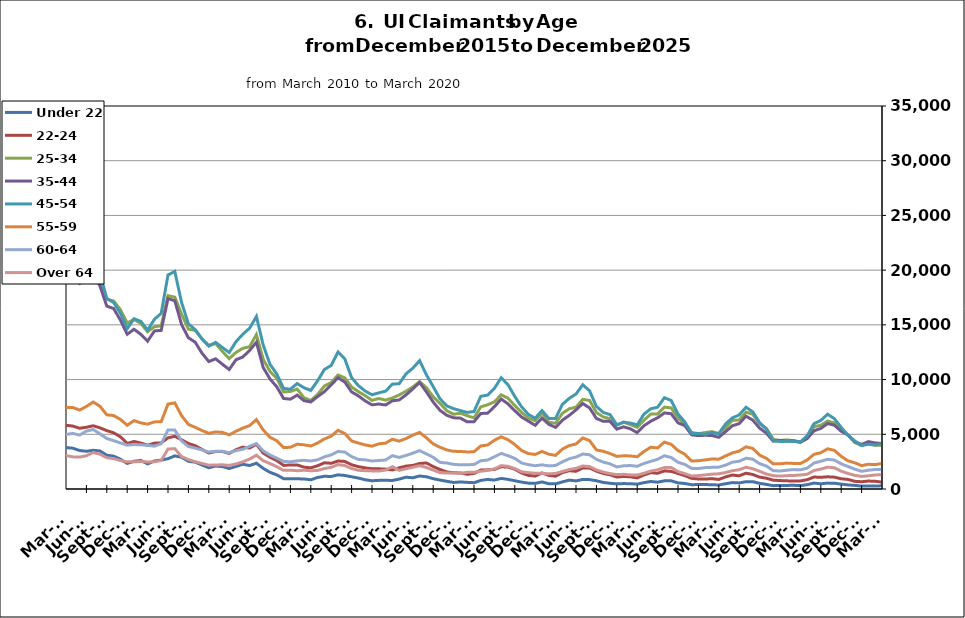
| Category | Under 22 | 22-24 | 25-34 | 35-44 | 45-54 | 55-59 | 60-64 | Over 64 |
|---|---|---|---|---|---|---|---|---|
| 1995-02-28 | 535 | 933 | 5740 | 6206 | 4029 | 1255 | 625 | 276 |
| 1995-03-31 | 534 | 992 | 5856 | 6433 | 4297 | 1294 | 686 | 323 |
| 1995-04-30 | 603 | 1125 | 6814 | 6965 | 4447 | 1392 | 730 | 338 |
| 1995-05-31 | 626 | 1171 | 7442 | 7404 | 4702 | 1383 | 751 | 333 |
| 1995-06-30 | 625 | 1218 | 7514 | 7778 | 4867 | 1435 | 813 | 366 |
| 1995-07-31 | 710 | 1296 | 8612 | 8864 | 5537 | 1595 | 891 | 407 |
| 1995-08-31 | 729 | 1248 | 8185 | 8719 | 5400 | 1604 | 982 | 406 |
| 1995-09-30 | 578 | 1028 | 6615 | 7150 | 4534 | 1351 | 862 | 338 |
| 1995-10-31 | 554 | 957 | 5805 | 6461 | 4159 | 1205 | 741 | 287 |
| 1995-11-30 | 468 | 845 | 5201 | 5826 | 3927 | 1155 | 702 | 254 |
| 1995-12-31 | 517 | 858 | 5350 | 5974 | 4010 | 1153 | 672 | 263 |
| 1996-01-31 | 543 | 927 | 5431 | 6086 | 4208 | 1221 | 685 | 301 |
| 1996-02-29 | 617 | 999 | 5667 | 6535 | 4480 | 1312 | 747 | 305 |
| 1996-03-31 | 622 | 981 | 5896 | 6557 | 4514 | 1362 | 763 | 306 |
| 1996-04-30 | 680 | 1140 | 7032 | 7649 | 5088 | 1527 | 856 | 345 |
| 1996-05-31 | 689 | 1163 | 7220 | 7819 | 5070 | 1521 | 832 | 366 |
| 1996-06-30 | 661 | 1145 | 7344 | 8173 | 5391 | 1568 | 844 | 388 |
| 1996-07-31 | 762 | 1250 | 8375 | 9181 | 6036 | 1755 | 973 | 432 |
| 1996-08-31 | 746 | 1145 | 7829 | 8585 | 5586 | 1651 | 950 | 435 |
| 1996-09-30 | 635 | 992 | 6399 | 7097 | 4790 | 1462 | 804 | 425 |
| 1996-10-31 | 572 | 851 | 5448 | 6291 | 4192 | 1259 | 693 | 340 |
| 1996-11-30 | 531 | 827 | 5003 | 5921 | 3908 | 1153 | 602 | 315 |
| 1996-12-31 | 521 | 789 | 4710 | 5510 | 3673 | 1110 | 610 | 284 |
| 1997-01-31 | 559 | 841 | 5203 | 6172 | 4321 | 1255 | 731 | 328 |
| 1997-02-28 | 556 | 841 | 5187 | 6162 | 4311 | 1250 | 727 | 326 |
| 1997-03-31 | 499 | 806 | 5125 | 6037 | 4176 | 1294 | 702 | 363 |
| 1997-04-30 | 545 | 885 | 5753 | 6709 | 4248 | 1339 | 734 | 339 |
| 1997-05-31 | 612 | 941 | 6146 | 7153 | 4458 | 1348 | 801 | 336 |
| 1997-06-30 | 623 | 995 | 6240 | 7298 | 4662 | 1302 | 776 | 348 |
| 1997-07-31 | 716 | 1154 | 7168 | 8554 | 5489 | 1509 | 903 | 415 |
| 1997-08-31 | 684 | 1072 | 6853 | 8093 | 5222 | 1487 | 837 | 416 |
| 1997-09-30 | 579 | 912 | 5522 | 6592 | 4348 | 1285 | 705 | 380 |
| 1997-10-31 | 516 | 817 | 4894.5 | 5892.5 | 3945 | 1159 | 625 | 344.5 |
| 1997-11-30 | 453 | 722 | 4267 | 5193 | 3542 | 1033 | 545 | 309 |
| 1997-12-31 | 413 | 682 | 3792 | 4755 | 3300 | 1023 | 490 | 266 |
| 1998-01-31 | 489 | 741 | 4044 | 5115 | 3513 | 1099 | 525 | 267 |
| 1998-02-28 | 435 | 684 | 3864 | 4903 | 3549 | 1043 | 571 | 285 |
| 1998-03-31 | 416 | 680 | 3855 | 5086 | 3703 | 1176 | 604 | 297 |
| 1998-04-30 | 592 | 813 | 5092 | 6219 | 4262 | 1336 | 688 | 332 |
| 1998-05-31 | 579 | 849 | 5319 | 6766 | 4554 | 1382 | 729 | 360 |
| 1998-06-30 | 568 | 899 | 5557 | 7101 | 4897 | 1405 | 783 | 367 |
| 1998-07-31 | 691 | 1031 | 6472 | 8095 | 5562 | 1589 | 880 | 392 |
| 1998-08-31 | 673 | 1007 | 6326 | 7950 | 5369 | 1574 | 935 | 393 |
| 1998-09-30 | 548 | 838 | 5206 | 6768 | 4703 | 1432 | 849 | 373 |
| 1998-10-31 | 496 | 776 | 4437 | 5582 | 3875 | 1250 | 711 | 302 |
| 1998-11-30 | 456 | 761 | 4182 | 5332 | 4015 | 1296 | 694 | 308 |
| 1998-12-31 | 442 | 722 | 4010 | 5198 | 4062 | 1331 | 656 | 290 |
| 1999-01-31 | 503 | 830 | 4502 | 5761 | 4521 | 1490 | 751 | 297 |
| 1999-02-28 | 463 | 756 | 4267 | 5576 | 4431 | 1470 | 767 | 301 |
| 1999-03-31 | 435 | 688 | 4119 | 5519 | 4403 | 1516 | 765 | 331 |
| 1999-04-30 | 591 | 949 | 5292 | 7089 | 5468 | 1724 | 914 | 489 |
| 1999-05-31 | 674 | 911 | 5611 | 7459 | 5457 | 1710 | 934 | 500 |
| 1999-06-30 | 640 | 906 | 5660 | 7503 | 5333 | 1695 | 920 | 495 |
| 1999-07-31 | 766 | 1132 | 6820 | 9256 | 6620 | 1981 | 1001 | 549 |
| 1999-08-31 | 738 | 1117 | 6737 | 9030 | 6670 | 2019 | 1075 | 582 |
| 1999-09-30 | 600 | 968 | 5167 | 7169 | 5458 | 1712 | 892 | 465 |
| 1999-10-31 | 494 | 813 | 4501 | 6048 | 4682 | 1443 | 743 | 363 |
| 1999-11-30 | 464 | 768 | 4228 | 5593 | 4564 | 1392 | 702 | 313 |
| 1999-12-31 | 468.5 | 754.5 | 4149 | 5486.5 | 4505 | 1429 | 673 | 304 |
| 2000-01-31 | 473 | 741 | 4070 | 5380 | 4446 | 1466 | 644 | 295 |
| 2000-02-29 | 460 | 691 | 3807 | 5357 | 4470 | 1469 | 707 | 310 |
| 2000-03-31 | 412 | 652 | 3864 | 5499 | 4568 | 1508 | 816 | 389 |
| 2000-04-30 | 585 | 829 | 4741 | 6891 | 5127 | 1631 | 906 | 451 |
| 2000-05-31 | 627 | 875 | 5086 | 7211 | 5238 | 1598 | 956 | 489 |
| 2000-06-30 | 675 | 983 | 5624 | 7826 | 5562 | 1669 | 941 | 524 |
| 2000-07-31 | 802 | 1109 | 6475 | 9102 | 6450 | 1927 | 1097 | 594 |
| 2000-08-31 | 787 | 1058 | 6045 | 8732 | 6157 | 1894 | 1085 | 616 |
| 2000-09-30 | 607 | 897 | 4766 | 6864 | 5037 | 1486 | 902 | 479 |
| 2000-10-31 | 544 | 760 | 4267 | 5897 | 4465 | 1323 | 762 | 394 |
| 2000-11-30 | 535 | 797 | 3982 | 5439 | 4318 | 1256 | 702 | 396 |
| 2000-12-31 | 508 | 832 | 3891 | 5255 | 4218 | 1246 | 694 | 361 |
| 2001-01-31 | 627 | 892 | 4229 | 5724 | 4777 | 1300 | 721 | 393 |
| 2001-02-28 | 643 | 934 | 4553 | 6302 | 5224 | 1529 | 849 | 472 |
| 2001-03-31 | 412 | 648 | 3625 | 5081 | 4551 | 1413 | 778 | 440 |
| 2001-04-30 | 875 | 1276 | 6577 | 8914 | 7196 | 2144 | 1185 | 639 |
| 2001-05-31 | 944 | 1399 | 7133 | 9570 | 7651 | 2265 | 1231 | 679 |
| 2001-06-30 | 1041 | 1584 | 8072 | 11034 | 8621 | 2613 | 1398 | 756 |
| 2001-07-31 | 1135 | 1806 | 9038 | 12514 | 9691 | 2970 | 1611 | 848 |
| 2001-08-31 | 1116 | 1776 | 8753 | 12045 | 9560 | 2963 | 1691 | 898 |
| 2001-09-30 | 1046 | 1705 | 8118 | 11025 | 8788 | 2784 | 1608 | 833 |
| 2001-10-31 | 1094 | 1785 | 8459 | 11114 | 8850 | 2772 | 1610 | 777 |
| 2001-11-30 | 1154 | 1931 | 9131 | 11576 | 9447 | 2973 | 1661 | 778 |
| 2001-12-31 | 1280 | 2191 | 9917 | 11961 | 9905 | 3152 | 1740 | 780 |
| 2002-01-31 | 1330 | 2255 | 10364 | 12730 | 10592 | 3378 | 1843 | 821 |
| 2002-02-28 | 1347 | 2339 | 10349 | 12730 | 10784 | 3499 | 1861 | 867 |
| 2002-03-31 | 1266 | 2231 | 9963 | 12747 | 10614 | 3499 | 1867 | 979 |
| 2002-04-30 | 1412 | 2488 | 11603 | 15825 | 13571 | 4631 | 2389 | 1146 |
| 2002-05-31 | 1455 | 2421 | 11243 | 15509 | 13148 | 4374 | 2359 | 1195 |
| 2002-06-30 | 1534 | 2479 | 11416 | 15594 | 13261 | 4343 | 2365 | 1180 |
| 2002-07-31 | 1513 | 2614 | 11895 | 16242 | 13727 | 4439 | 2428 | 1255 |
| 2002-08-31 | 1022 | 1977 | 8719 | 12054 | 10588 | 3454 | 1990 | 1047 |
| 2002-09-30 | 1391 | 2528 | 10478 | 14010 | 12008 | 3847 | 2161 | 1166 |
| 2002-10-31 | 1401 | 2385 | 9826 | 12727 | 10778 | 3498 | 1886 | 973 |
| 2002-11-30 | 1344 | 2390 | 9846 | 12059 | 10297 | 3367 | 1833 | 958 |
| 2002-12-31 | 1311 | 2403 | 9841 | 11670 | 10177 | 3369 | 1871 | 894 |
| 2003-01-31 | 1311 | 2403 | 9841 | 11670 | 10177 | 3369 | 1871 | 894 |
| 2003-02-28 | 1367 | 2275 | 9730 | 12433 | 10806 | 3687 | 2016 | 974 |
| 2003-03-31 | 1367 | 2357 | 9844 | 12620 | 11167 | 3825 | 2151 | 1094 |
| 2003-04-30 | 1549 | 2525 | 10619 | 14142 | 12182 | 4004 | 2304 | 1190 |
| 2003-05-31 | 1663 | 2698 | 10843 | 14795 | 12539 | 4102 | 2395 | 1256 |
| 2003-06-30 | 1755 | 2770 | 11350 | 15575 | 13251 | 4301 | 2493 | 1325 |
| 2003-07-31 | 1748 | 2791 | 11577 | 15863 | 13772 | 4465 | 2593 | 1371 |
| 2003-08-31 | 1718 | 2653 | 10998 | 15261 | 13219 | 4325 | 2522 | 1359 |
| 2003-09-30 | 1494 | 2521 | 10071 | 13565 | 11659 | 3828 | 2278 | 1286 |
| 2003-10-31 | 1329 | 2432 | 9388 | 12107 | 10693 | 3567 | 2036 | 1129 |
| 2003-11-30 | 1191 | 2226 | 8954 | 11297 | 10037 | 3414 | 2004 | 1068 |
| 2003-12-31 | 1206 | 2184 | 8530 | 10413 | 9335 | 3215 | 1854 | 994 |
| 2004-01-31 | 1216 | 2171 | 8382 | 9858 | 8955 | 2992 | 1736 | 963 |
| 2004-02-29 | 1118 | 1879 | 7614 | 8935 | 8176 | 2761 | 1617 | 943 |
| 2004-03-31 | 1099 | 1749 | 7152 | 8565 | 7769 | 2686 | 1608 | 981 |
| 2004-04-30 | 1241 | 1951 | 7653 | 9981 | 8741 | 2872 | 1685 | 1056 |
| 2004-05-31 | 1245 | 1934 | 7651 | 10203 | 8820 | 2928 | 1703 | 1079 |
| 2004-06-30 | 1316 | 2086 | 8172 | 10636 | 9362 | 3146 | 1843 | 1081 |
| 2004-07-31 | 1476 | 2265 | 8795 | 11511 | 10439 | 3497 | 2008 | 1171 |
| 2004-08-31 | 1390 | 2055 | 8008 | 10418 | 9514 | 3304 | 1909 | 1105 |
| 2004-09-30 | 1129 | 1820 | 6987 | 8661 | 7694 | 2755 | 1623 | 1046 |
| 2004-10-31 | 1037 | 1675 | 6590 | 7964 | 7029 | 2459 | 1461 | 882 |
| 2004-11-30 | 954 | 1638 | 6342 | 7570 | 6733 | 2294 | 1383 | 841 |
| 2004-12-31 | 857 | 1533 | 5921 | 6991 | 6333 | 2225 | 1287 | 764 |
| 2005-01-31 | 893 | 1539 | 6047 | 7410 | 6682 | 2253 | 1274 | 788 |
| 2005-02-28 | 846 | 1361 | 5650 | 6952 | 6404 | 2198 | 1326 | 786 |
| 2005-03-31 | 747 | 1258 | 5313 | 6595 | 6251 | 2151 | 1327 | 742 |
| 2005-04-30 | 877 | 1375 | 5696 | 7717 | 7230 | 2440 | 1401 | 844 |
| 2005-05-31 | 854 | 1408 | 5674 | 7905 | 7454 | 2482 | 1453 | 858 |
| 2005-06-30 | 819 | 1444 | 6028 | 8565 | 7899 | 2613 | 1547 | 890 |
| 2005-07-31 | 900 | 1461 | 6395 | 9124 | 8614 | 2864 | 1640 | 1004 |
| 2005-08-31 | 805 | 1439 | 5917 | 8271 | 8076 | 2692 | 1587 | 945 |
| 2005-09-30 | 631 | 1209 | 4978 | 6413 | 6203 | 2116 | 1312 | 724 |
| 2005-10-31 | 638 | 1134 | 4602 | 6028 | 5688 | 1997 | 1171 | 656 |
| 2005-11-30 | 564 | 1071 | 4409 | 5563 | 5105 | 1791 | 1035 | 580 |
| 2005-12-31 | 523 | 987 | 4014 | 4983 | 4531 | 1673 | 968 | 546 |
| 2006-01-31 | 531 | 925 | 3900 | 5012 | 4793 | 1691 | 1008 | 539 |
| 2006-02-28 | 447 | 804 | 3534 | 4388 | 4403 | 1586 | 980 | 549 |
| 2006-03-31 | 399 | 785 | 3455 | 4472 | 4584 | 1680 | 1069 | 618 |
| 2006-04-30 | 527 | 945 | 4004 | 5859 | 5921 | 1965 | 1251 | 744 |
| 2006-05-31 | 594 | 964 | 4205 | 6365 | 6369 | 2156 | 1327 | 792 |
| 2006-06-30 | 660 | 1113 | 4742 | 7052 | 7094 | 2386 | 1474 | 933 |
| 2006-07-31 | 771 | 1183 | 5214 | 7974 | 8007 | 2685 | 1635 | 1072 |
| 2006-08-31 | 737 | 1202 | 5116 | 7524 | 7553 | 2671 | 1590 | 1019 |
| 2006-09-30 | 596 | 1086 | 4608 | 6175 | 6389 | 2256 | 1287 | 812 |
| 2006-10-31 | 596 | 1056 | 4585 | 5758 | 5788 | 2026 | 1164 | 696 |
| 2006-11-30 | 542 | 1003 | 4370 | 5304 | 5388 | 1812 | 1082 | 604 |
| 2006-12-31 | 553 | 1102 | 4425 | 5291 | 5310 | 1801 | 1099 | 603 |
| 2007-01-31 | 587 | 1147 | 4542 | 5619 | 5506 | 1920 | 1174 | 663 |
| 2007-02-28 | 544 | 1090 | 4490 | 5562 | 5616 | 1982 | 1260 | 705 |
| 2007-03-31 | 558 | 1089 | 4498 | 5595 | 5708 | 2016 | 1378 | 717 |
| 2007-04-30 | 760 | 1203 | 5015 | 6827 | 6871 | 2316 | 1536 | 856 |
| 2007-05-31 | 806 | 1285 | 5542 | 7679 | 7763 | 2571 | 1719 | 1021 |
| 2007-06-30 | 862 | 1340 | 6100 | 8324 | 8341 | 2812 | 1896 | 1060 |
| 2007-07-31 | 980 | 1524 | 6616 | 9184 | 9522 | 3226 | 2038 | 1250 |
| 2007-08-31 | 950 | 1510 | 6266 | 8359 | 8842 | 3033 | 1949 | 1157 |
| 2007-09-30 | 865 | 1595 | 6213 | 7798 | 7957 | 2790 | 1816 | 1090 |
| 2007-10-31 | 883 | 1517 | 6214 | 7229 | 7503 | 2574 | 1630 | 978 |
| 2007-11-15 | 816 | 1424 | 5981 | 6740 | 6999 | 2468 | 1510 | 860 |
| 2007-12-15 09:36:00 | 851 | 1536 | 6411 | 6986 | 7174 | 2572 | 1584 | 874 |
| 2008-01-14 19:12:00 | 963 | 1628 | 6836 | 7533 | 7742 | 2786 | 1744 | 940 |
| 2008-02-14 04:48:00 | 982 | 1565 | 6847 | 7767 | 8031 | 2958 | 1823 | 985 |
| 2008-03-15 14:24:00 | 1029 | 1666 | 7210 | 8036 | 8353 | 3105 | 1898 | 1085 |
| 2008-04-15 | 1182 | 1889 | 7894 | 9339 | 9822 | 3537 | 2184 | 1246 |
| 2008-05-15 09:36:00 | 1325 | 2099 | 8651 | 10315 | 11003 | 3871 | 2423 | 1448 |
| 2008-06-14 19:12:00 | 1405 | 2238 | 9567 | 11330 | 12040 | 4322 | 2650 | 1572 |
| 2008-07-15 04:48:00 | 1616 | 2488 | 10336 | 12349 | 13396 | 4698 | 3083 | 1801 |
| 2008-08-14 14:24:00 | 1753 | 2665 | 10716 | 12486 | 13444 | 4795 | 3139 | 1802 |
| 2008-09-14 | 1800 | 2924 | 11552 | 12686 | 13602 | 4801 | 3180 | 1811 |
| 2008-10-14 09:36:00 | 1936 | 3131 | 12284 | 13322 | 13831 | 4989 | 3183 | 1808 |
| 2008-11-13 19:12:00 | 2093 | 3414 | 13577 | 14724 | 15130 | 5413 | 3440 | 1946 |
| 2008-12-14 04:48:00 | 2495 | 4020 | 15380 | 16325 | 16846 | 6098 | 3755 | 2155 |
| 2009-01-13 14:24:00 | 3054 | 4678 | 17678 | 18452 | 19095 | 6788 | 4182 | 2364 |
| 2009-02-13 | 3531 | 5304 | 19793 | 20788 | 21601 | 7727 | 4836 | 2718 |
| 2009-03-15 09:36:00 | 3891 | 5925 | 22303 | 23139 | 24352 | 8876 | 5515 | 3141 |
| 2009-04-14 19:12:00 | 4291 | 6403 | 23925 | 25362 | 26817 | 9618 | 6020 | 3494 |
| 2009-05-15 04:48:00 | 4410 | 6521 | 24301 | 25794 | 27238 | 9735 | 6181 | 3529 |
| 2009-06-14 14:24:00 | 4405 | 6853 | 25234 | 26806 | 28296 | 10256 | 6673 | 3804 |
| 2009-07-15 | 4729 | 7280 | 26132 | 27836 | 29724 | 10830 | 6950 | 4125 |
| 2009-08-14 09:36:00 | 4717 | 7069 | 25281 | 26184 | 27877 | 10164 | 6719 | 3918 |
| 2009-09-13 19:12:00 | 4741 | 7291 | 25029 | 24981 | 26018 | 9679 | 6210 | 3594 |
| 2009-10-14 04:48:00 | 4656 | 7051 | 24241 | 23779 | 24730 | 9034 | 5817 | 3422 |
| 2009-11-13 14:24:00 | 4421 | 6817 | 23760 | 22851 | 23515 | 8627 | 5549 | 3297 |
| 2009-12-14 | 4232 | 6586 | 23118 | 22038 | 22501 | 8496 | 5370 | 3295 |
| 2010-01-13 09:36:00 | 4276 | 6583 | 22706 | 21421 | 22132 | 8135 | 5154 | 3134 |
| 2010-02-12 19:12:00 | 4133 | 6142 | 21386 | 20012 | 21036 | 7728 | 5039 | 3047 |
| 2010-03-15 04:48:00 | 3784 | 5822 | 20418 | 19073 | 20556 | 7446 | 4983 | 3062 |
| 2010-04-14 14:24:00 | 3731 | 5751 | 20058 | 19261 | 21012 | 7449 | 5078 | 2936 |
| 2010-05-15 | 3516 | 5553 | 19393 | 18793 | 20409 | 7213 | 4923 | 2915 |
| 2010-06-14 09:36:00 | 3450 | 5640 | 19615 | 19385 | 20781 | 7547 | 5293 | 3043 |
| 2010-07-14 19:12:00 | 3536 | 5781 | 19820 | 19714 | 21269 | 7946 | 5439 | 3330 |
| 2010-08-14 04:48:00 | 3477 | 5590 | 18902 | 18548 | 19686 | 7561 | 5039 | 3181 |
| 2010-09-13 14:24:00 | 3083 | 5332 | 17344 | 16712 | 17408 | 6775 | 4612 | 2859 |
| 2010-10-14 | 3004 | 5138 | 17187 | 16492 | 17042 | 6713 | 4418 | 2779 |
| 2010-11-13 09:36:00 | 2724 | 4771 | 16387 | 15438 | 16061 | 6360 | 4209 | 2601 |
| 2010-12-13 19:12:00 | 2335 | 4159 | 15175 | 14143 | 14646 | 5823 | 4003 | 2480 |
| 2011-01-13 04:48:00 | 2530 | 4343 | 15492 | 14596 | 15561 | 6250 | 4059 | 2487 |
| 2011-02-12 14:24:00 | 2609 | 4202 | 15131 | 14142 | 15320 | 6044 | 4041 | 2517 |
| 2011-03-15 | 2290 | 3998 | 14370 | 13505 | 14523 | 5925 | 3990 | 2470 |
| 2011-04-14 09:36:00 | 2563 | 4190 | 14834 | 14445 | 15508 | 6130 | 3916 | 2488 |
| 2011-05-14 19:12:00 | 2642 | 4217 | 14917 | 14494 | 16051 | 6156 | 4129 | 2602 |
| 2011-06-14 04:48:00 | 2767 | 4676 | 17673 | 17404 | 19563 | 7763 | 5398 | 3653 |
| 2011-07-14 14:24:00 | 3027 | 4815 | 17530 | 17197 | 19880 | 7870 | 5384 | 3686 |
| 2011-08-14 | 2900 | 4498 | 15970 | 15020 | 17035 | 6697 | 4394 | 2956 |
| 2011-09-13 09:36:00 | 2531 | 4156 | 14609 | 13818 | 15092 | 5903 | 3881 | 2687 |
| 2011-10-13 19:12:00 | 2452 | 3959 | 14501 | 13415 | 14565 | 5635 | 3734 | 2491 |
| 2011-11-13 04:48:00 | 2197 | 3615 | 13732 | 12410 | 13698 | 5345 | 3574 | 2339 |
| 2011-12-13 14:24:00 | 1938 | 3290 | 13130 | 11646 | 13054 | 5089 | 3380 | 2177 |
| 2012-01-13 | 2098 | 3424 | 13293 | 11897 | 13400 | 5218 | 3448 | 2197 |
| 2012-02-12 09:36:00 | 2047 | 3428 | 12569 | 11400 | 12931 | 5177 | 3445 | 2212 |
| 2012-03-13 19:12:00 | 1870 | 3252 | 11913 | 10922 | 12476 | 4948 | 3317 | 2155 |
| 2012-04-13 04:48:00 | 2063 | 3590 | 12479 | 11814 | 13464 | 5278 | 3509 | 2287 |
| 2012-05-13 14:24:00 | 2260 | 3828 | 12852 | 12063 | 14139 | 5562 | 3628 | 2485 |
| 2012-06-13 | 2147 | 3747 | 13008 | 12659 | 14694 | 5791 | 3902 | 2736 |
| 2012-07-13 09:36:00 | 2358 | 4087 | 14109 | 13412 | 15770 | 6346 | 4156 | 3086 |
| 2012-08-12 19:12:00 | 1887 | 3284 | 11852 | 11102 | 13153 | 5396 | 3487 | 2583 |
| 2012-09-12 04:48:00 | 1524 | 2903 | 10742 | 10051 | 11393 | 4726 | 3103 | 2327 |
| 2012-10-12 14:24:00 | 1289 | 2603 | 10123 | 9339 | 10510 | 4405 | 2813 | 2032 |
| 2012-11-12 | 945 | 2155 | 8870 | 8273 | 9193 | 3781 | 2520 | 1702 |
| 2012-12-12 09:36:00 | 937 | 2201 | 8913 | 8210 | 9124 | 3816 | 2491 | 1722 |
| 2013-01-11 19:12:00 | 934 | 2199 | 9132 | 8579 | 9635 | 4095 | 2569 | 1667 |
| 2013-02-11 04:48:00 | 915 | 1996 | 8343 | 8072 | 9253 | 4034 | 2623 | 1715 |
| 2013-03-13 14:24:00 | 845 | 1934 | 8092 | 7955 | 9007 | 3929 | 2561 | 1667 |
| 2013-04-13 | 1055 | 2124 | 8637 | 8445 | 9891 | 4204 | 2666 | 1698 |
| 2013-05-13 09:36:00 | 1160 | 2394 | 9413 | 8898 | 10920 | 4574 | 2940 | 1871 |
| 2013-06-12 19:12:00 | 1145 | 2351 | 9732 | 9510 | 11293 | 4830 | 3115 | 1976 |
| 2013-07-13 04:48:00 | 1294 | 2558 | 10421 | 10174 | 12520 | 5363 | 3434 | 2233 |
| 2013-08-12 14:24:00 | 1238 | 2519 | 10150 | 9771 | 11886 | 5067 | 3372 | 2140 |
| 2013-09-12 | 1116 | 2214 | 9323 | 8874 | 10178 | 4389 | 2964 | 1871 |
| 2013-10-12 09:36:00 | 1000 | 2044 | 8893 | 8509 | 9449 | 4200 | 2701 | 1709 |
| 2013-11-11 19:12:00 | 842 | 1927 | 8532 | 8049 | 8950 | 4028 | 2665 | 1675 |
| 2013-12-12 04:48:00 | 753 | 1854 | 8098 | 7692 | 8612 | 3913 | 2557 | 1655 |
| 2014-01-11 14:24:00 | 788 | 1846 | 8270 | 7762 | 8786 | 4128 | 2606 | 1642 |
| 2014-02-11 | 795 | 1817 | 8124 | 7677 | 8944 | 4189 | 2646 | 1728 |
| 2014-03-13 09:36:00 | 782 | 1741 | 8319 | 8063 | 9583 | 4550 | 3048 | 2040 |
| 2014-04-12 19:12:00 | 905 | 1940 | 8594 | 8138 | 9620 | 4372 | 2886 | 1706 |
| 2014-05-13 04:48:00 | 1079 | 2093 | 8933 | 8593 | 10522 | 4609 | 3062 | 1850 |
| 2014-06-12 14:24:00 | 1028 | 2152 | 9323 | 9148 | 11040 | 4920 | 3274 | 1985 |
| 2014-07-13 | 1189 | 2333 | 9808 | 9735 | 11729 | 5171 | 3509 | 2133 |
| 2014-08-14 | 1119 | 2379 | 9259 | 8876 | 10438 | 4678 | 3210 | 1962 |
| 2014-09-13 09:36:00 | 943 | 2048 | 8430 | 7946 | 9358 | 4119 | 2891 | 1734 |
| 2014-10-13 19:12:00 | 816 | 1781 | 7821 | 7185 | 8244 | 3813 | 2437 | 1486 |
| 2014-11-13 04:48:00 | 703 | 1557 | 7150 | 6736 | 7594 | 3571 | 2374 | 1466 |
| 2014-12-13 14:24:00 | 597 | 1482 | 6833 | 6507 | 7340 | 3442 | 2255 | 1458 |
| 2015-01-13 | 646 | 1466 | 6927 | 6477 | 7168 | 3432 | 2210 | 1429 |
| 2015-02-12 09:36:00 | 607 | 1346 | 6696 | 6134 | 6999 | 3383 | 2220 | 1525 |
| 2015-03-14 19:12:00 | 577 | 1416 | 6499 | 6145 | 7077 | 3405 | 2233 | 1530 |
| 2015-04-14 04:48:00 | 784 | 1736 | 7505 | 6901 | 8468 | 3935 | 2586 | 1624 |
| 2015-05-14 14:24:00 | 875 | 1749 | 7696 | 6925 | 8578 | 4020 | 2644 | 1698 |
| 2015-06-14 | 818 | 1789 | 7961 | 7519 | 9200 | 4452 | 2943 | 1839 |
| 2015-07-14 09:36:00 | 966 | 2033 | 8609 | 8223 | 10167 | 4766 | 3254 | 2136 |
| 2015-08-13 19:12:00 | 880 | 2007 | 8302 | 7779 | 9530 | 4503 | 3045 | 2073 |
| 2015-09-13 04:48:00 | 752 | 1807 | 7615 | 7153 | 8455 | 4067 | 2798 | 1870 |
| 2015-10-13 14:24:00 | 630 | 1461 | 6995 | 6578 | 7509 | 3519 | 2375 | 1570 |
| 2015-11-13 | 533 | 1246 | 6491 | 6196 | 6815 | 3237 | 2224 | 1493 |
| 2015-12-13 09:36:00 | 512 | 1179 | 6242 | 5823 | 6474 | 3158 | 2123 | 1439 |
| 2016-01-12 19:12:00 | 646 | 1466 | 6927 | 6477 | 7168 | 3432 | 2210 | 1429 |
| 2016-02-12 04:48:00 | 482 | 1246 | 6101 | 5912 | 6452 | 3180 | 2110 | 1385 |
| 2016-03-13 14:24:00 | 474 | 1170 | 6011 | 5629 | 6452 | 3073 | 2152 | 1420 |
| 2016-04-13 | 648 | 1494 | 6917 | 6287 | 7737 | 3648 | 2483 | 1600 |
| 2016-05-13 09:36:00 | 812 | 1670 | 7326 | 6725 | 8279 | 3967 | 2765 | 1776 |
| 2016-06-12 19:12:00 | 738 | 1622 | 7479 | 7230 | 8681 | 4111 | 2920 | 1886 |
| 2016-07-13 04:48:00 | 875 | 1919 | 8193 | 7814 | 9525 | 4662 | 3196 | 2105 |
| 2016-08-12 14:24:00 | 858 | 1920 | 8091 | 7407 | 8969 | 4420 | 3130 | 2050 |
| 2016-09-12 | 752 | 1632 | 6992 | 6450 | 7548 | 3573 | 2713 | 1747 |
| 2016-10-12 09:36:00 | 602 | 1423 | 6590 | 6190 | 6998 | 3448 | 2457 | 1544 |
| 2016-11-11 19:12:00 | 523 | 1296 | 6418 | 6179 | 6801 | 3241 | 2299 | 1410 |
| 2016-12-12 04:48:00 | 468 | 1096 | 5827 | 5472 | 5867 | 2981 | 2019 | 1311 |
| 2017-01-11 14:24:00 | 495 | 1150 | 6111 | 5679 | 6108 | 3035 | 2115 | 1342 |
| 2017-02-11 | 484 | 1109 | 5882 | 5500 | 6023 | 3023 | 2148 | 1289 |
| 2017-03-13 09:36:00 | 442 | 1015 | 5634 | 5148 | 5865 | 2942 | 2075 | 1278 |
| 2017-04-12 19:12:00 | 585 | 1285 | 6292 | 5783 | 6842 | 3434 | 2336 | 1435 |
| 2017-05-13 04:48:00 | 686 | 1492 | 6844 | 6200 | 7332 | 3817 | 2526 | 1637 |
| 2017-06-12 14:24:00 | 623 | 1435 | 6852 | 6505 | 7473 | 3751 | 2713 | 1754 |
| 2017-07-13 | 745 | 1658 | 7483 | 6953 | 8339 | 4284 | 3038 | 1964 |
| 2017-08-12 09:36:00 | 745 | 1605 | 7411 | 6880 | 8092 | 4080 | 2878 | 1966 |
| 2017-09-11 19:12:00 | 559 | 1420 | 6481 | 6045 | 6845 | 3511 | 2443 | 1591 |
| 2017-10-12 04:48:00 | 503 | 1224 | 5960 | 5790 | 6135 | 3181 | 2245 | 1400 |
| 2017-11-11 14:24:00 | 390 | 972 | 5167 | 4951 | 5077 | 2553 | 1887 | 1188 |
| 2017-12-12 | 413 | 914 | 5058 | 4876 | 5071 | 2585 | 1870 | 1226 |
| 2018-01-11 09:36:00 | 411 | 912 | 5154 | 4909 | 5000 | 2656 | 1952 | 1288 |
| 2018-02-10 19:12:00 | 383 | 940 | 5246 | 4884 | 5165 | 2743 | 1980 | 1355 |
| 2018-03-13 04:48:00 | 373 | 875 | 5018 | 4724 | 5075 | 2723 | 1999 | 1389 |
| 2018-04-12 14:24:00 | 478 | 1104 | 5584 | 5240 | 5944 | 3026 | 2179 | 1506 |
| 2018-05-13 | 586 | 1275 | 6280 | 5780 | 6500 | 3300 | 2452 | 1670 |
| 2018-06-12 09:36:00 | 554 | 1207 | 6302 | 5974 | 6766 | 3462 | 2534 | 1762 |
| 2018-07-12 19:12:00 | 666 | 1445 | 7024 | 6656 | 7473 | 3858 | 2810 | 1989 |
| 2018-08-12 04:48:00 | 671 | 1323 | 6823 | 6293 | 7046 | 3706 | 2722 | 1850 |
| 2018-09-11 14:24:00 | 518 | 1084 | 5965 | 5563 | 6066 | 3091 | 2318 | 1618 |
| 2018-10-12 | 419 | 985 | 5538 | 5106 | 5464 | 2806 | 2102 | 1367 |
| 2018-11-11 09:36:00 | 306 | 808 | 4542 | 4371 | 4433 | 2297 | 1673 | 1222 |
| 2018-12-11 19:12:00 | 328 | 771 | 4439 | 4429 | 4340 | 2303 | 1646 | 1174 |
| 2019-01-11 04:48:00 | 327 | 743 | 4491 | 4378 | 4359 | 2368 | 1715 | 1218 |
| 2019-02-10 14:24:00 | 338 | 739 | 4402 | 4415 | 4345 | 2337 | 1773 | 1237 |
| 2019-03-13 | 306 | 738 | 4246 | 4293 | 4304 | 2328 | 1756 | 1281 |
| 2019-04-12 09:36:00 | 396 | 850 | 4657 | 4603 | 4871 | 2655 | 1900 | 1347 |
| 2019-05-12 19:12:00 | 541 | 1092 | 5700 | 5319 | 5974 | 3169 | 2371 | 1690 |
| 2019-06-12 04:48:00 | 476 | 1070 | 5822 | 5537 | 6262 | 3317 | 2534 | 1820 |
| 2019-07-12 14:24:00 | 538 | 1114 | 6206 | 5980 | 6836 | 3673 | 2717 | 1996 |
| 2019-08-12 | 528 | 1084 | 6044 | 5828 | 6422 | 3535 | 2645 | 1942 |
| 2019-09-11 09:36:00 | 445 | 932 | 5379 | 5275 | 5630 | 2979 | 2299 | 1624 |
| 2019-10-11 19:12:00 | 372 | 877 | 4949 | 4938 | 4922 | 2579 | 2058 | 1418 |
| 2019-11-11 04:48:00 | 332 | 701 | 4242 | 4332 | 4379 | 2392 | 1809 | 1247 |
| 2019-12-11 14:24:00 | 261 | 663 | 3977 | 4071 | 3974 | 2137 | 1619 | 1150 |
| 2020-01-11 | 272 | 724 | 4153 | 4331 | 4085 | 2258 | 1715 | 1206 |
| 2020-02-10 09:36:00 | 274 | 704 | 3992 | 4211 | 4020 | 2226 | 1784 | 1286 |
| 2020-03-11 19:12:00 | 291 | 630 | 3985 | 4153 | 4136 | 2332 | 1794 | 1308 |